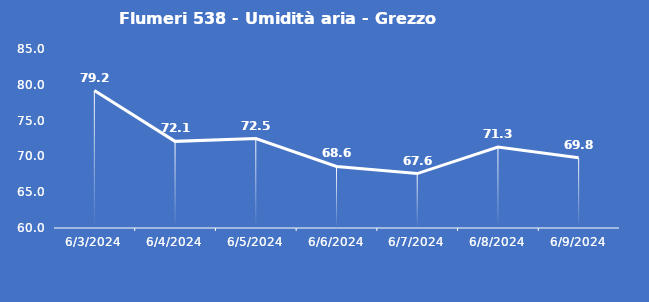
| Category | Flumeri 538 - Umidità aria - Grezzo (%) |
|---|---|
| 6/3/24 | 79.2 |
| 6/4/24 | 72.1 |
| 6/5/24 | 72.5 |
| 6/6/24 | 68.6 |
| 6/7/24 | 67.6 |
| 6/8/24 | 71.3 |
| 6/9/24 | 69.8 |